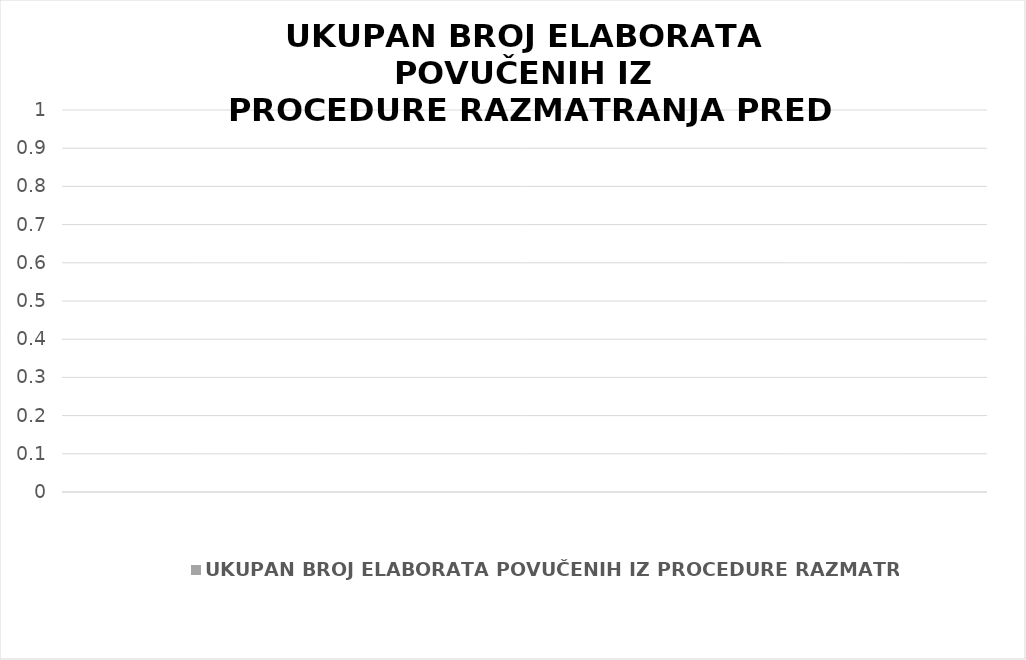
| Category | UKUPAN BROJ ELABORATA POVUČENIH IZ PROCEDURE RAZMATRANJA |
|---|---|
|  | 0 |
|  | 0 |
|  | 0 |